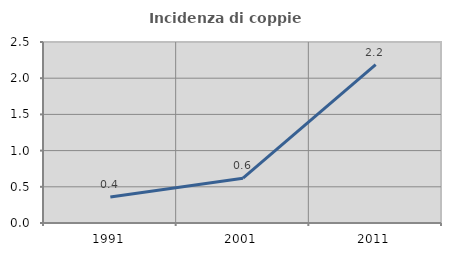
| Category | Incidenza di coppie miste |
|---|---|
| 1991.0 | 0.359 |
| 2001.0 | 0.619 |
| 2011.0 | 2.187 |